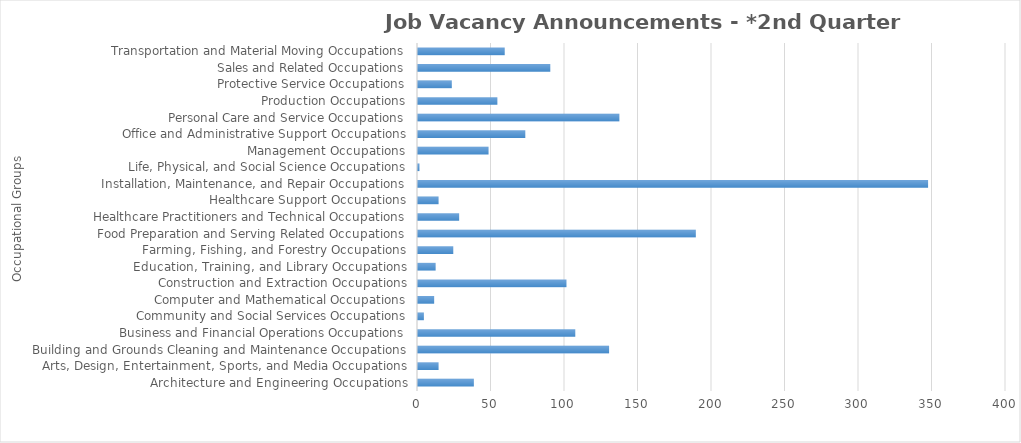
| Category | Total JVAs |
|---|---|
| Architecture and Engineering Occupations | 38 |
| Arts, Design, Entertainment, Sports, and Media Occupations | 14 |
| Building and Grounds Cleaning and Maintenance Occupations | 130 |
| Business and Financial Operations Occupations | 107 |
| Community and Social Services Occupations | 4 |
| Computer and Mathematical Occupations | 11 |
| Construction and Extraction Occupations | 101 |
| Education, Training, and Library Occupations | 12 |
| Farming, Fishing, and Forestry Occupations | 24 |
| Food Preparation and Serving Related Occupations | 189 |
| Healthcare Practitioners and Technical Occupations | 28 |
| Healthcare Support Occupations | 14 |
| Installation, Maintenance, and Repair Occupations | 347 |
| Life, Physical, and Social Science Occupations | 1 |
| Management Occupations | 48 |
| Office and Administrative Support Occupations | 73 |
| Personal Care and Service Occupations | 137 |
| Production Occupations | 54 |
| Protective Service Occupations | 23 |
| Sales and Related Occupations | 90 |
| Transportation and Material Moving Occupations | 59 |